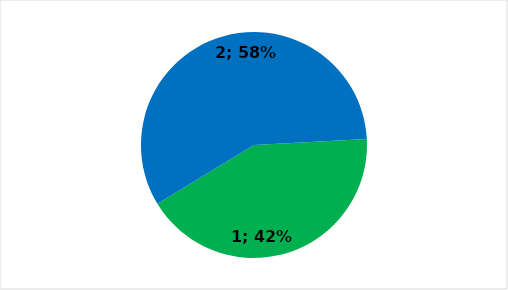
| Category | Series 0 |
|---|---|
| 0 | 244 |
| 1 | 335 |